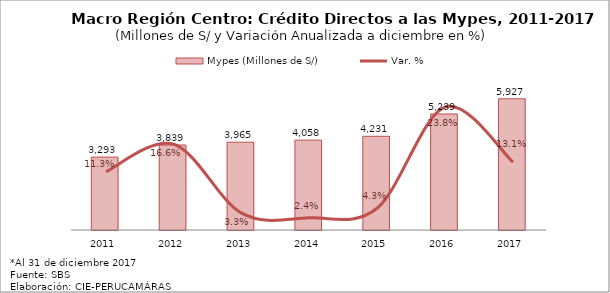
| Category | Mypes (Millones de S/) |
|---|---|
| 2011.0 | 3292.618 |
| 2012.0 | 3839.255 |
| 2013.0 | 3964.642 |
| 2014.0 | 4058.12 |
| 2015.0 | 4231.064 |
| 2016.0 | 5238.98 |
| 2017.0 | 5926.661 |